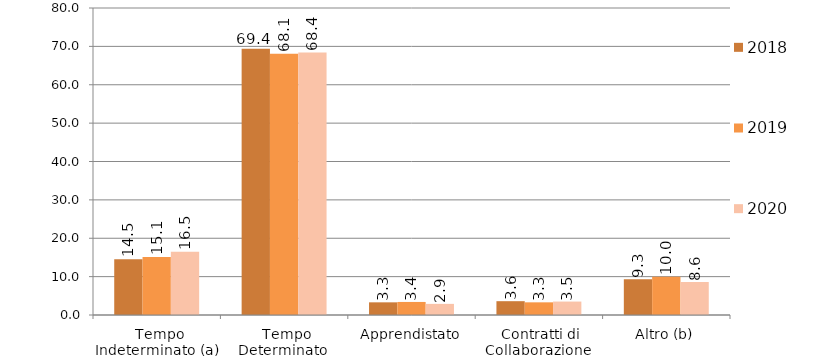
| Category | 2018 | 2019 | 2020 |
|---|---|---|---|
|  Tempo Indeterminato (a) | 14.5 | 15.1 | 16.5 |
|  Tempo Determinato  | 69.4 | 68.1 | 68.4 |
|  Apprendistato  | 3.3 | 3.4 | 2.9 |
|  Contratti di Collaborazione  | 3.6 | 3.3 | 3.5 |
|  Altro (b)  | 9.3 | 10 | 8.6 |